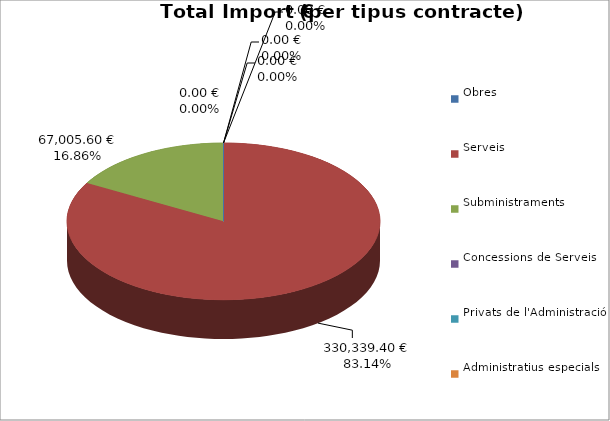
| Category | Total preu
(amb IVA) |
|---|---|
| Obres | 0 |
| Serveis | 330339.4 |
| Subministraments | 67005.6 |
| Concessions de Serveis | 0 |
| Privats de l'Administració | 0 |
| Administratius especials | 0 |